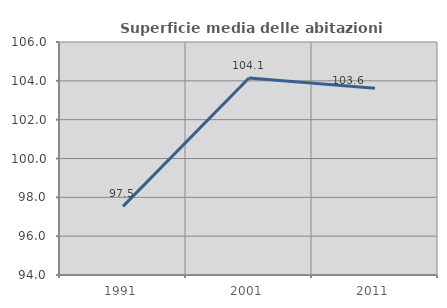
| Category | Superficie media delle abitazioni occupate |
|---|---|
| 1991.0 | 97.535 |
| 2001.0 | 104.148 |
| 2011.0 | 103.614 |